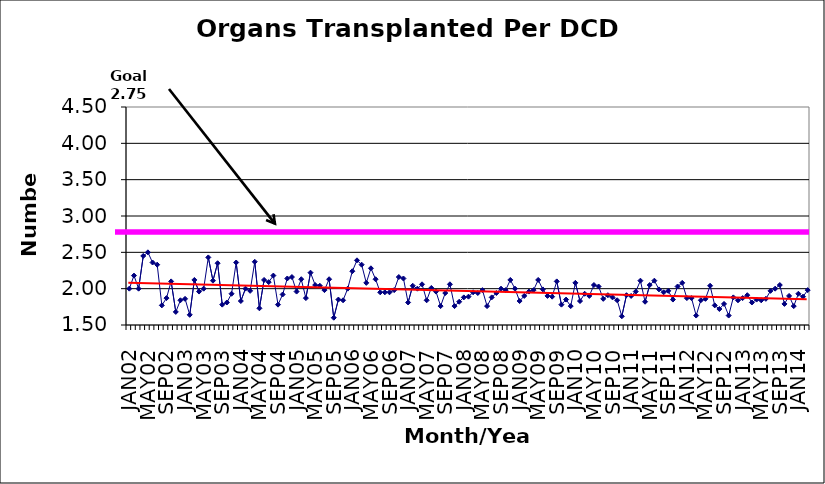
| Category | Series 0 |
|---|---|
| JAN02 | 2 |
| FEB02 | 2.18 |
| MAR02 | 2 |
| APR02 | 2.45 |
| MAY02 | 2.5 |
| JUN02 | 2.36 |
| JUL02 | 2.33 |
| AUG02 | 1.77 |
| SEP02 | 1.87 |
| OCT02 | 2.1 |
| NOV02 | 1.68 |
| DEC02 | 1.84 |
| JAN03 | 1.86 |
| FEB03 | 1.64 |
| MAR03 | 2.12 |
| APR03 | 1.96 |
| MAY03 | 2 |
| JUN03 | 2.43 |
| JUL03 | 2.11 |
| AUG03 | 2.35 |
| SEP03 | 1.78 |
| OCT03 | 1.81 |
| NOV03 | 1.93 |
| DEC03 | 2.36 |
| JAN04 | 1.83 |
| FEB04 | 2 |
| MAR04 | 1.97 |
| APR04 | 2.37 |
| MAY04 | 1.73 |
| JUN04 | 2.12 |
| JUL04 | 2.09 |
| AUG04 | 2.18 |
| SEP04 | 1.78 |
| OCT04 | 1.92 |
| NOV04 | 2.14 |
| DEC04 | 2.16 |
| JAN05 | 1.96 |
| FEB05 | 2.13 |
| MAR05 | 1.87 |
| APR05 | 2.22 |
| MAY05 | 2.05 |
| JUN05 | 2.04 |
| JUL05 | 1.98 |
| AUG05 | 2.13 |
| SEP05 | 1.6 |
| OCT05 | 1.85 |
| NOV05 | 1.84 |
| DEC05 | 2 |
| JAN06 | 2.24 |
| FEB06 | 2.39 |
| MAR06 | 2.33 |
| APR06 | 2.08 |
| MAY06 | 2.28 |
| JUN06 | 2.13 |
| JUL06 | 1.95 |
| AUG06 | 1.95 |
| SEP06 | 1.95 |
| OCT06 | 1.98 |
| NOV06 | 2.16 |
| DEC06 | 2.14 |
| JAN07 | 1.81 |
| FEB07 | 2.04 |
| MAR07 | 2 |
| APR07 | 2.06 |
| MAY07 | 1.84 |
| JUN07 | 2.01 |
| JUL07 | 1.96 |
| AUG07 | 1.76 |
| SEP07 | 1.94 |
| OCT07 | 2.06 |
| NOV07 | 1.76 |
| DEC07 | 1.82 |
| JAN08 | 1.88 |
| FEB08 | 1.89 |
| MAR08 | 1.95 |
| APR08 | 1.94 |
| MAY08 | 1.98 |
| JUN08 | 1.76 |
| JUL08 | 1.88 |
| AUG08 | 1.94 |
| SEP08 | 2 |
| OCT08 | 1.98 |
| NOV08 | 2.12 |
| DEC08 | 2 |
| JAN09 | 1.83 |
| FEB09 | 1.9 |
| MAR09 | 1.96 |
| APR09 | 1.98 |
| MAY09 | 2.12 |
| JUN09 | 1.99 |
| JUL09 | 1.9 |
| AUG09 | 1.89 |
| SEP09 | 2.1 |
| OCT09 | 1.78 |
| NOV09 | 1.85 |
| DEC09 | 1.76 |
| JAN10 | 2.08 |
| FEB10 | 1.83 |
| MAR10 | 1.93 |
| APR10 | 1.9 |
| MAY10 | 2.05 |
| JUN10 | 2.03 |
| JUL10 | 1.86 |
| AUG10 | 1.91 |
| SEP10 | 1.88 |
| OCT10 | 1.84 |
| NOV10 | 1.62 |
| DEC10 | 1.91 |
| JAN11 | 1.9 |
| FEB11 | 1.96 |
| MAR11 | 2.11 |
| APR11 | 1.82 |
| MAY11 | 2.05 |
| JUN11 | 2.11 |
| JUL11 | 1.99 |
| AUG11 | 1.95 |
| SEP11 | 1.97 |
| OCT11 | 1.85 |
| NOV11 | 2.03 |
| DEC11 | 2.08 |
| JAN12 | 1.87 |
| FEB12 | 1.87 |
| MAR12 | 1.63 |
| APR12 | 1.84 |
| MAY12 | 1.86 |
| JUN12 | 2.04 |
| JUL12 | 1.77 |
| AUG12 | 1.72 |
| SEP12 | 1.79 |
| OCT12 | 1.63 |
| NOV12 | 1.88 |
| DEC12 | 1.84 |
| JAN13 | 1.87 |
| FEB13 | 1.91 |
| MAR13 | 1.81 |
| APR13 | 1.85 |
| MAY13 | 1.84 |
| JUN13 | 1.86 |
| JUL13 | 1.97 |
| AUG13 | 2 |
| SEP13 | 2.05 |
| OCT13 | 1.79 |
| NOV13 | 1.9 |
| DEC13 | 1.76 |
| JAN14 | 1.93 |
| FEB14 | 1.89 |
| MAR14 | 1.98 |